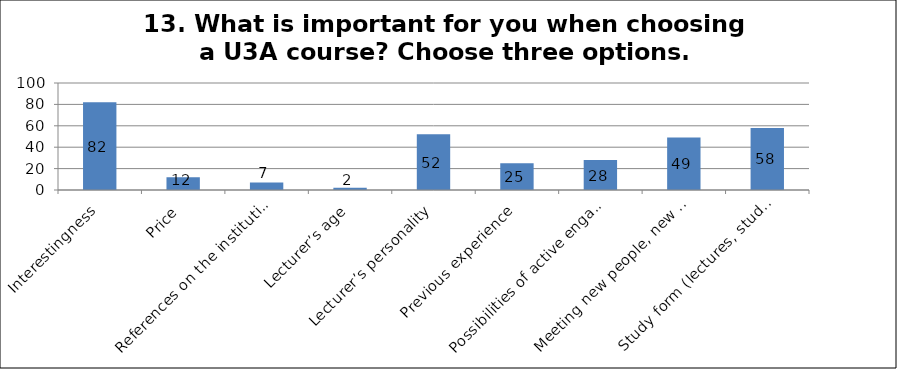
| Category | Series 0 |
|---|---|
| Interestingness | 82 |
| Price | 12 |
| References on the institution | 7 |
| Lecturer’s age | 2 |
| Lecturer’s personality | 52 |
| Previous experience | 25 |
| Possibilities of active engagement in U3A | 28 |
| Meeting new people, new social contacts | 49 |
| Study form (lectures, studies over the Internet, excursions) | 58 |